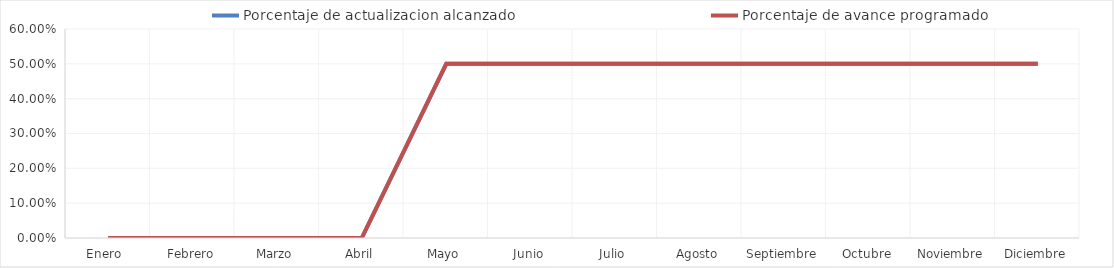
| Category | Porcentaje de actualizacion alcanzado | Porcentaje de avance programado |
|---|---|---|
| Enero  | 0 | 0 |
| Febrero | 0 | 0 |
| Marzo | 0 | 0 |
| Abril | 0 | 0 |
| Mayo | 0.5 | 0.5 |
| Junio | 0.5 | 0.5 |
| Julio | 0.5 | 0.5 |
| Agosto | 0.5 | 0.5 |
| Septiembre | 0.5 | 0.5 |
| Octubre | 0.5 | 0.5 |
| Noviembre | 0.5 | 0.5 |
| Diciembre | 0.5 | 0.5 |